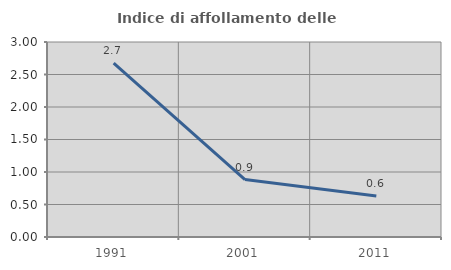
| Category | Indice di affollamento delle abitazioni  |
|---|---|
| 1991.0 | 2.676 |
| 2001.0 | 0.884 |
| 2011.0 | 0.632 |